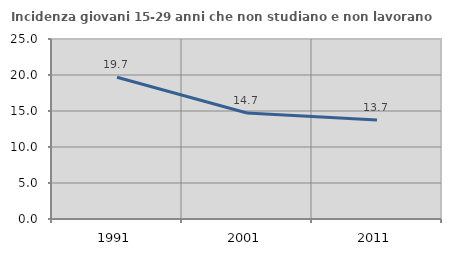
| Category | Incidenza giovani 15-29 anni che non studiano e non lavorano  |
|---|---|
| 1991.0 | 19.694 |
| 2001.0 | 14.715 |
| 2011.0 | 13.747 |